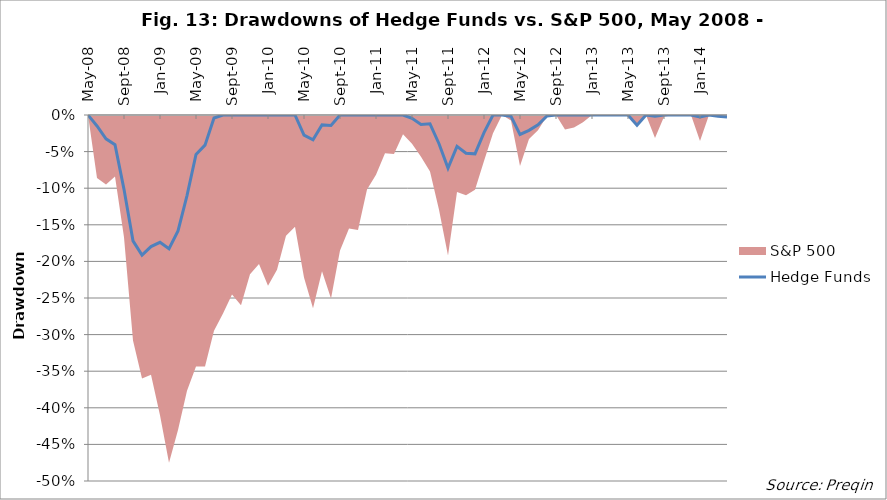
| Category | Hedge Funds |
|---|---|
| 2008-05-31 | 0 |
| 2008-06-30 | -0.015 |
| 2008-07-31 | -0.033 |
| 2008-08-31 | -0.041 |
| 2008-09-30 | -0.102 |
| 2008-10-31 | -0.172 |
| 2008-11-30 | -0.191 |
| 2008-12-31 | -0.18 |
| 2009-01-31 | -0.174 |
| 2009-02-28 | -0.183 |
| 2009-03-31 | -0.158 |
| 2009-04-30 | -0.11 |
| 2009-05-31 | -0.054 |
| 2009-06-30 | -0.041 |
| 2009-07-31 | -0.004 |
| 2009-08-31 | 0 |
| 2009-09-30 | 0 |
| 2009-10-31 | 0 |
| 2009-11-30 | 0 |
| 2009-12-31 | 0 |
| 2010-01-31 | 0 |
| 2010-02-28 | 0 |
| 2010-03-31 | 0 |
| 2010-04-30 | 0 |
| 2010-05-31 | -0.027 |
| 2010-06-30 | -0.034 |
| 2010-07-31 | -0.014 |
| 2010-08-31 | -0.014 |
| 2010-09-30 | 0 |
| 2010-10-31 | 0 |
| 2010-11-30 | 0 |
| 2010-12-31 | 0 |
| 2011-01-31 | 0 |
| 2011-02-28 | 0 |
| 2011-03-31 | 0 |
| 2011-04-30 | 0 |
| 2011-05-31 | -0.004 |
| 2011-06-30 | -0.013 |
| 2011-07-31 | -0.012 |
| 2011-08-31 | -0.039 |
| 2011-09-30 | -0.072 |
| 2011-10-31 | -0.043 |
| 2011-11-30 | -0.052 |
| 2011-12-31 | -0.053 |
| 2012-01-31 | -0.024 |
| 2012-02-29 | 0 |
| 2012-03-31 | 0 |
| 2012-04-30 | -0.002 |
| 2012-05-31 | -0.027 |
| 2012-06-30 | -0.021 |
| 2012-07-31 | -0.013 |
| 2012-08-31 | -0.001 |
| 2012-09-30 | 0 |
| 2012-10-31 | 0 |
| 2012-11-30 | 0 |
| 2012-12-31 | 0 |
| 2013-01-31 | 0 |
| 2013-02-28 | 0 |
| 2013-03-31 | 0 |
| 2013-04-30 | 0 |
| 2013-05-31 | 0 |
| 2013-06-30 | -0.014 |
| 2013-07-31 | 0 |
| 2013-08-31 | -0.002 |
| 2013-09-30 | 0 |
| 2013-10-31 | 0 |
| 2013-11-30 | 0 |
| 2013-12-31 | 0 |
| 2014-01-31 | -0.003 |
| 2014-02-28 | 0 |
| 2014-03-31 | -0.002 |
| 2014-04-30 | -0.003 |